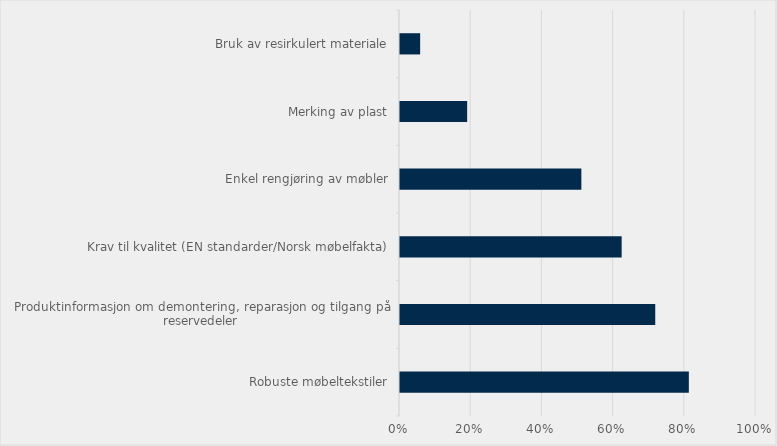
| Category | Prosentvis andel  anskaffelser som har stilt kr |
|---|---|
| Robuste møbeltekstiler | 0.811 |
| Produktinformasjon om demontering, reparasjon og tilgang på reservedeler | 0.717 |
| Krav til kvalitet (EN standarder/Norsk møbelfakta) | 0.623 |
| Enkel rengjøring av møbler | 0.509 |
| Merking av plast | 0.189 |
| Bruk av resirkulert materiale | 0.057 |